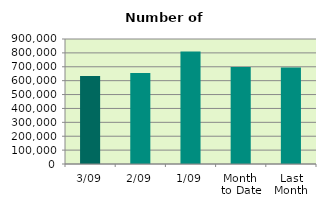
| Category | Series 0 |
|---|---|
| 3/09 | 632872 |
| 2/09 | 655062 |
| 1/09 | 809784 |
| Month 
to Date | 699239.333 |
| Last
Month | 695004.455 |